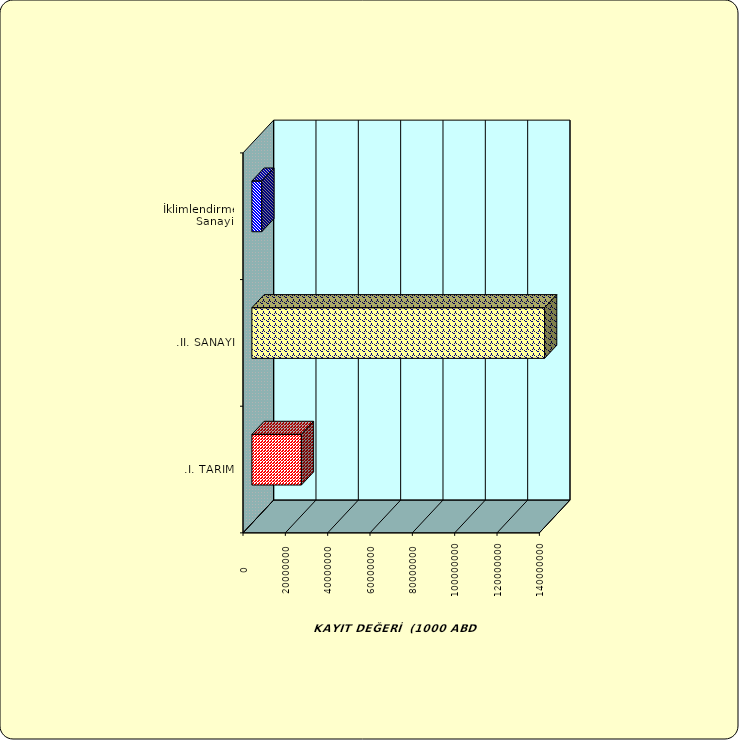
| Category | Series 0 |
|---|---|
| .I. TARIM | 23394512.187 |
| .II. SANAYİ | 138253658.514 |
|  İklimlendirme Sanayii | 4679065.658 |